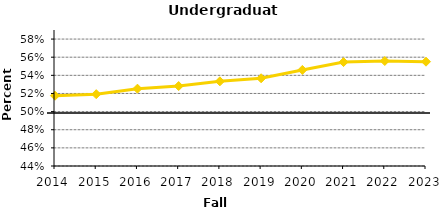
| Category | Series 0 |
|---|---|
| 2014.0 | 0.518 |
| 2015.0 | 0.519 |
| 2016.0 | 0.525 |
| 2017.0 | 0.528 |
| 2018.0 | 0.533 |
| 2019.0 | 0.537 |
| 2020.0 | 0.546 |
| 2021.0 | 0.555 |
| 2022.0 | 0.556 |
| 2023.0 | 0.555 |